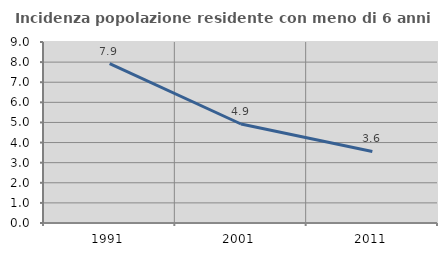
| Category | Incidenza popolazione residente con meno di 6 anni |
|---|---|
| 1991.0 | 7.93 |
| 2001.0 | 4.923 |
| 2011.0 | 3.559 |